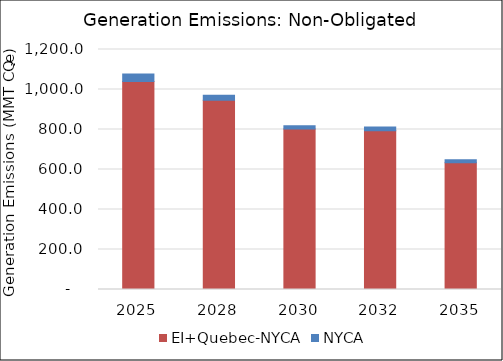
| Category | EI+Quebec-NYCA | NYCA |
|---|---|---|
| 2025.0 | 1040.26 | 37 |
| 2028.0 | 946.81 | 24.46 |
| 2030.0 | 803.01 | 15.67 |
| 2032.0 | 793.63 | 18.63 |
| 2035.0 | 633.33 | 15.97 |